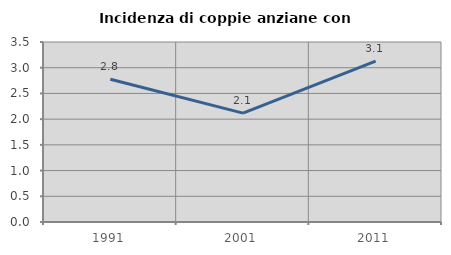
| Category | Incidenza di coppie anziane con figli |
|---|---|
| 1991.0 | 2.776 |
| 2001.0 | 2.116 |
| 2011.0 | 3.127 |